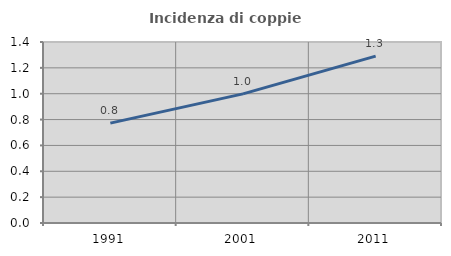
| Category | Incidenza di coppie miste |
|---|---|
| 1991.0 | 0.773 |
| 2001.0 | 0.999 |
| 2011.0 | 1.291 |